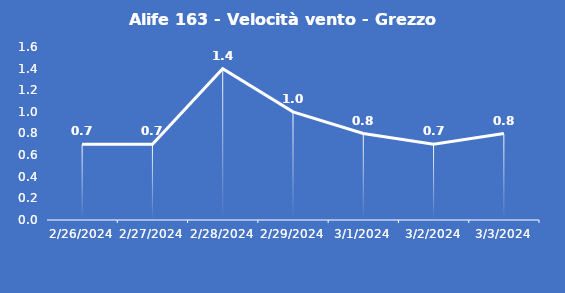
| Category | Alife 163 - Velocità vento - Grezzo (m/s) |
|---|---|
| 2/26/24 | 0.7 |
| 2/27/24 | 0.7 |
| 2/28/24 | 1.4 |
| 2/29/24 | 1 |
| 3/1/24 | 0.8 |
| 3/2/24 | 0.7 |
| 3/3/24 | 0.8 |